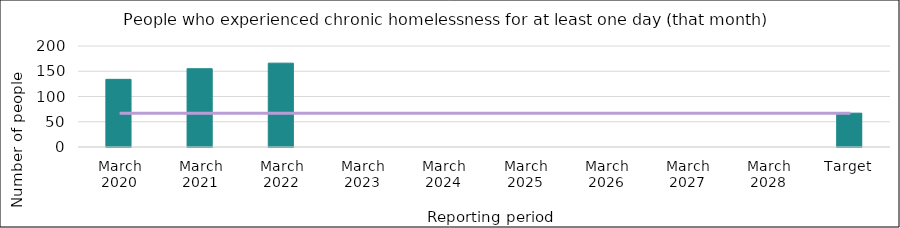
| Category | Series 0 |
|---|---|
| March 2020 | 134 |
| March 2021 | 155 |
| March 2022 | 166 |
| March 2023 | 0 |
| March 2024 | 0 |
| March 2025 | 0 |
| March 2026 | 0 |
| March 2027 | 0 |
| March 2028 | 0 |
| Target | 67 |